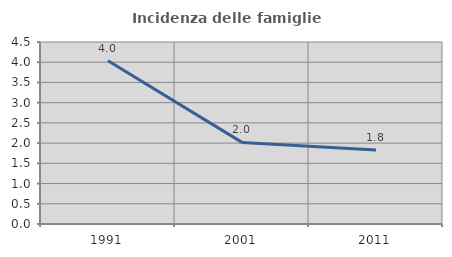
| Category | Incidenza delle famiglie numerose |
|---|---|
| 1991.0 | 4.036 |
| 2001.0 | 2.018 |
| 2011.0 | 1.829 |